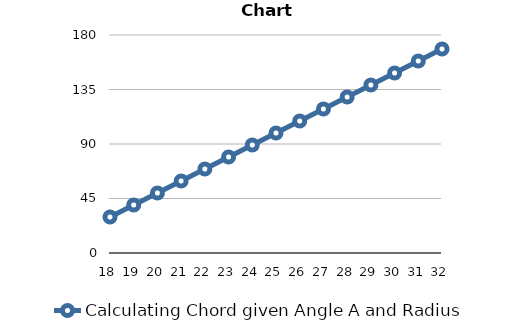
| Category | Calculating Chord given Angle A and Radius |
|---|---|
| 18 | 29.721 |
| 19 | 39.628 |
| 20 | 49.535 |
| 21 | 59.443 |
| 22 | 69.35 |
| 23 | 79.257 |
| 24 | 89.164 |
| 25 | 99.071 |
| 26 | 108.978 |
| 27 | 118.885 |
| 28 | 128.792 |
| 29 | 138.699 |
| 30 | 148.606 |
| 31 | 158.514 |
| 32 | 168.421 |